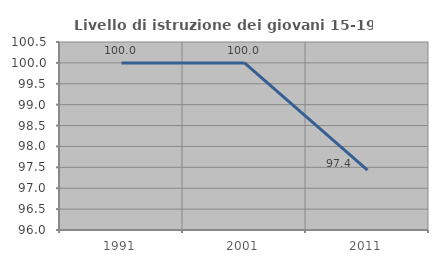
| Category | Livello di istruzione dei giovani 15-19 anni |
|---|---|
| 1991.0 | 100 |
| 2001.0 | 100 |
| 2011.0 | 97.436 |